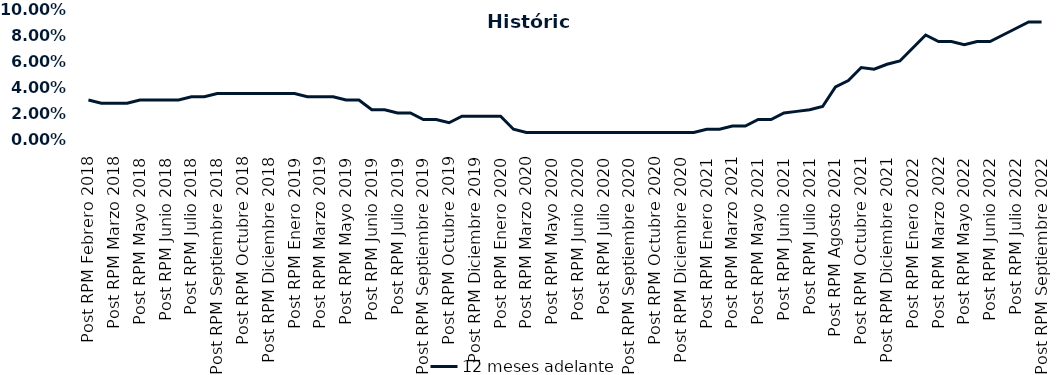
| Category | 12 meses adelante  |
|---|---|
| Post RPM Febrero 2018 | 0.03 |
| Pre RPM Marzo 2018 | 0.028 |
| Post RPM Marzo 2018 | 0.028 |
| Pre RPM Mayo 2018 | 0.028 |
| Post RPM Mayo 2018 | 0.03 |
| Pre RPM Junio 2018 | 0.03 |
| Post RPM Junio 2018 | 0.03 |
| Pre RPM Julio 2018 | 0.03 |
| Post RPM Julio 2018 | 0.032 |
| Pre RPM Septiembre 2018 | 0.032 |
| Post RPM Septiembre 2018 | 0.035 |
| Pre RPM Octubre 2018 | 0.035 |
| Post RPM Octubre 2018 | 0.035 |
| Pre RPM Diciembre 2018 | 0.035 |
| Post RPM Diciembre 2018 | 0.035 |
| Pre RPM Enero 2019 | 0.035 |
| Post RPM Enero 2019 | 0.035 |
| Pre RPM Marzo 2019 | 0.032 |
| Post RPM Marzo 2019 | 0.032 |
| Pre RPM Mayo 2019 | 0.032 |
| Post RPM Mayo 2019 | 0.03 |
| Pre RPM Junio 2019 | 0.03 |
| Post RPM Junio 2019 | 0.022 |
| Pre RPM Julio 2019 | 0.022 |
| Post RPM Julio 2019 | 0.02 |
| Pre RPM Septiembre 2019 | 0.02 |
| Post RPM Septiembre 2019 | 0.015 |
| Pre RPM Octubre 2019 | 0.015 |
| Post RPM Octubre 2019 | 0.012 |
| Pre RPM Diciembre 2019 | 0.018 |
| Post RPM Diciembre 2019 | 0.018 |
| Pre RPM Enero 2020 | 0.018 |
| Post RPM Enero 2020 | 0.018 |
| Pre RPM Marzo 2020 | 0.008 |
| Post RPM Marzo 2020 | 0.005 |
| Pre RPM Mayo 2020 | 0.005 |
| Post RPM Mayo 2020 | 0.005 |
| Pre RPM Junio 2020 | 0.005 |
| Post RPM Junio 2020 | 0.005 |
| Pre RPM Julio 2020 | 0.005 |
| Post RPM Julio 2020 | 0.005 |
| Pre RPM Septiembre 2020 | 0.005 |
| Post RPM Septiembre 2020 | 0.005 |
| Pre RPM Octubre 2020 | 0.005 |
| Post RPM Octubre 2020 | 0.005 |
| Pre RPM Diciembre 2020 | 0.005 |
| Post RPM Diciembre 2020 | 0.005 |
| Pre RPM Enero 2021 | 0.005 |
| Post RPM Enero 2021 | 0.008 |
| Pre RPM Marzo 2021 | 0.008 |
| Post RPM Marzo 2021 | 0.01 |
| Pre RPM Mayo 2021 | 0.01 |
| Post RPM Mayo 2021 | 0.015 |
| Pre RPM Junio 2021 | 0.015 |
| Post RPM Junio 2021 | 0.02 |
| Pre RPM Julio 2021 | 0.021 |
| Post RPM Julio 2021 | 0.022 |
| Pre RPM Agosto 2021 | 0.025 |
| Post RPM Agosto 2021 | 0.04 |
| Pre RPM Octubre 2021 | 0.045 |
| Post RPM Octubre 2021 | 0.055 |
| Pre RPM Diciembre 2021 | 0.054 |
| Post RPM Diciembre 2021 | 0.058 |
| Pre RPM Enero 2022 | 0.06 |
| Post RPM Enero 2022 | 0.07 |
| Pre RPM Marzo 2022 | 0.08 |
| Post RPM Marzo 2022 | 0.075 |
| Pre RPM Mayo 2022 | 0.075 |
| Post RPM Mayo 2022 | 0.072 |
| Pre RPM Junio 2022 | 0.075 |
| Post RPM Junio 2022 | 0.075 |
| Pre RPM Julio 2022 | 0.08 |
| Post RPM Julio 2022 | 0.085 |
| Pre RPM Septiembre 2022 | 0.09 |
| Post RPM Septiembre 2022 | 0.09 |